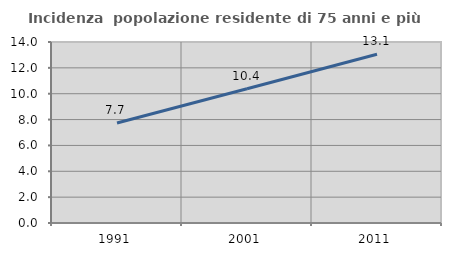
| Category | Incidenza  popolazione residente di 75 anni e più |
|---|---|
| 1991.0 | 7.729 |
| 2001.0 | 10.387 |
| 2011.0 | 13.058 |